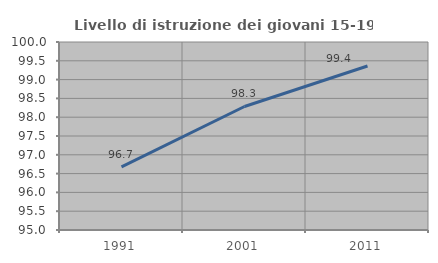
| Category | Livello di istruzione dei giovani 15-19 anni |
|---|---|
| 1991.0 | 96.68 |
| 2001.0 | 98.285 |
| 2011.0 | 99.362 |